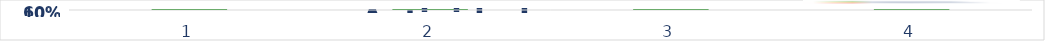
| Category | Series 0 |
|---|---|
| 0 | 0.95 |
| 1 | 0.98 |
| 2 | 0.96 |
| 3 | 0.98 |